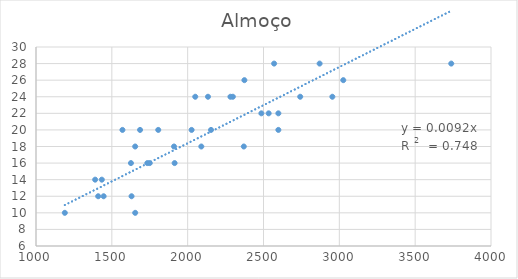
| Category | Almoço |
|---|---|
| 2870.0 | 28 |
| 1570.0 | 20 |
| 2374.0 | 26 |
| 2026.0 | 20 |
| 1410.0 | 12 |
| 2598.0 | 20 |
| 2370.0 | 18 |
| 1910.0 | 18 |
| 3738.0 | 28 |
| 2570.0 | 28 |
| 1654.0 | 10 |
| 1630.0 | 12 |
| 1626.0 | 16 |
| 1390.0 | 14 |
| 2298.0 | 24 |
| 1190.0 | 10 |
| 2742.0 | 24 |
| 2486.0 | 22 |
| 1446.0 | 12 |
| 2534.0 | 22 |
| 2090.0 | 18 |
| 1806.0 | 20 |
| 1654.0 | 18 |
| 2050.0 | 24 |
| 2134.0 | 24 |
| 1434.0 | 14 |
| 1914.0 | 16 |
| 1734.0 | 16 |
| 2282.0 | 24 |
| 2954.0 | 24 |
| 1686.0 | 20 |
| 2598.0 | 22 |
| 1750.0 | 16 |
| 3026.0 | 26 |
| 2154.0 | 20 |